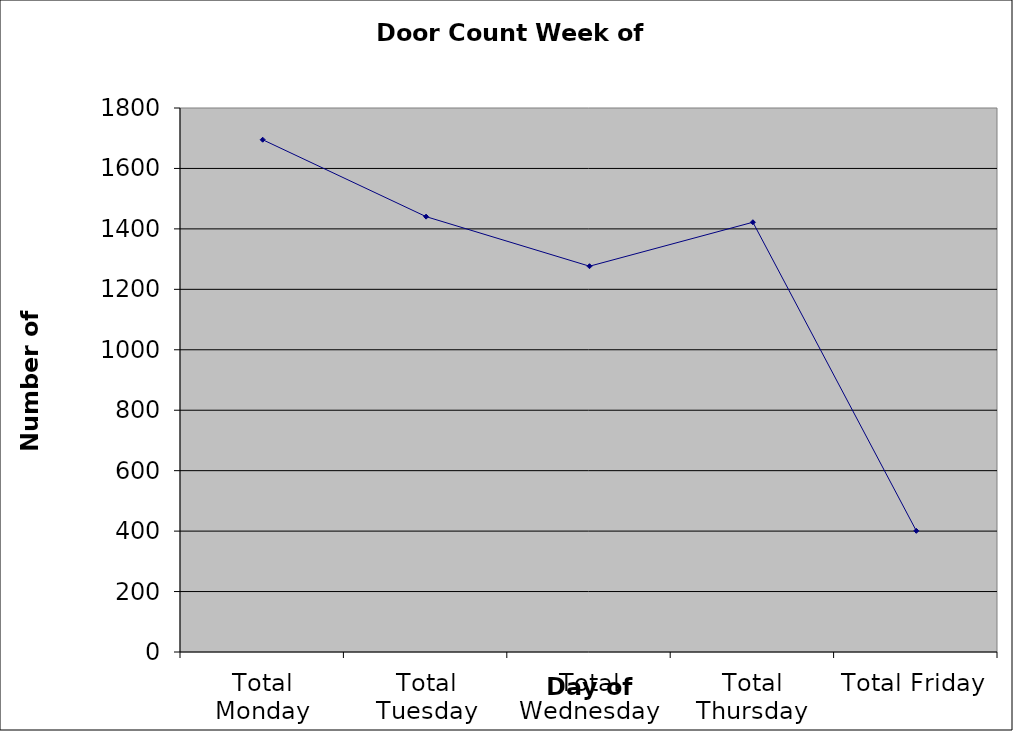
| Category | Series 0 |
|---|---|
| Total Monday | 1695 |
| Total Tuesday | 1440.5 |
| Total Wednesday | 1276.5 |
| Total Thursday | 1422 |
| Total Friday | 401 |